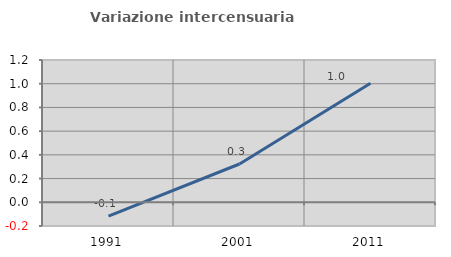
| Category | Variazione intercensuaria annua |
|---|---|
| 1991.0 | -0.117 |
| 2001.0 | 0.323 |
| 2011.0 | 1.004 |